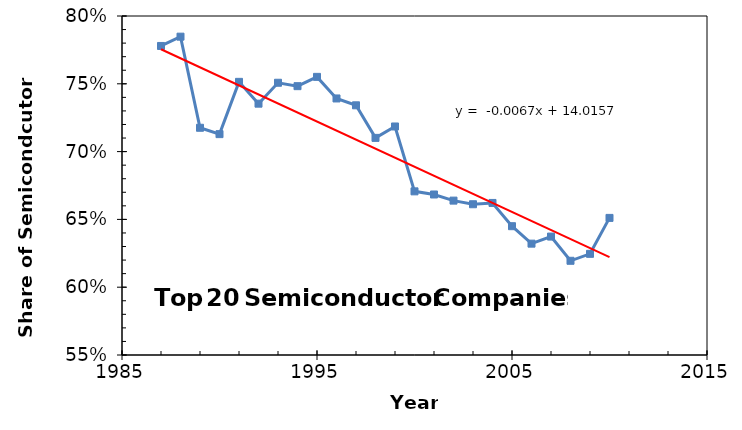
| Category | Series 0 |
|---|---|
| 1987.0 | 0.778 |
| 1988.0 | 0.785 |
| 1989.0 | 0.718 |
| 1990.0 | 0.713 |
| 1991.0 | 0.751 |
| 1992.0 | 0.735 |
| 1993.0 | 0.751 |
| 1994.0 | 0.748 |
| 1995.0 | 0.755 |
| 1996.0 | 0.739 |
| 1997.0 | 0.734 |
| 1998.0 | 0.71 |
| 1999.0 | 0.719 |
| 2000.0 | 0.671 |
| 2001.0 | 0.668 |
| 2002.0 | 0.664 |
| 2003.0 | 0.661 |
| 2004.0 | 0.662 |
| 2005.0 | 0.645 |
| 2006.0 | 0.632 |
| 2007.0 | 0.637 |
| 2008.0 | 0.619 |
| 2009.0 | 0.625 |
| 2010.0 | 0.651 |